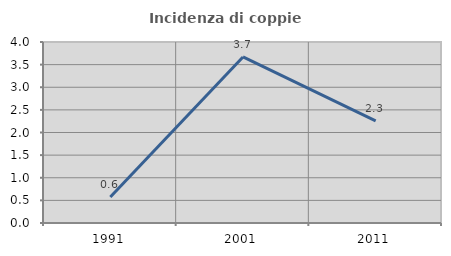
| Category | Incidenza di coppie miste |
|---|---|
| 1991.0 | 0.575 |
| 2001.0 | 3.67 |
| 2011.0 | 2.258 |